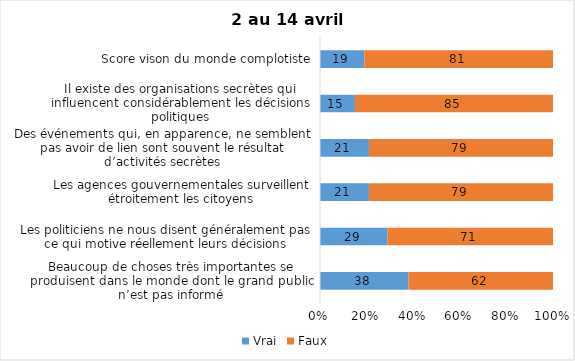
| Category | Vrai | Faux |
|---|---|---|
| Beaucoup de choses très importantes se produisent dans le monde dont le grand public n’est pas informé | 38 | 62 |
| Les politiciens ne nous disent généralement pas ce qui motive réellement leurs décisions | 29 | 71 |
| Les agences gouvernementales surveillent étroitement les citoyens | 21 | 79 |
| Des événements qui, en apparence, ne semblent pas avoir de lien sont souvent le résultat d’activités secrètes | 21 | 79 |
| Il existe des organisations secrètes qui influencent considérablement les décisions politiques | 15 | 85 |
| Score vison du monde complotiste | 19 | 81 |